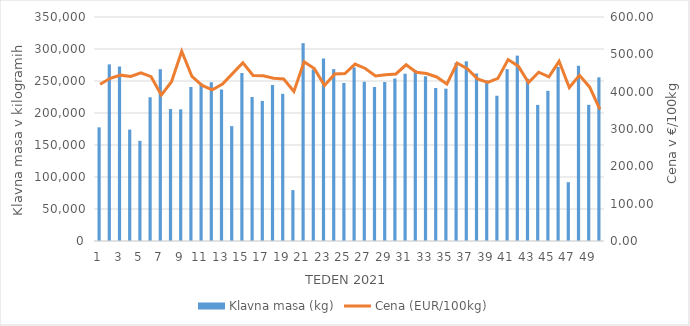
| Category | Klavna masa (kg) |
|---|---|
| 1.0 | 177573 |
| 2.0 | 275951 |
| 3.0 | 272797 |
| 4.0 | 174056 |
| 5.0 | 156508 |
| 6.0 | 224595 |
| 7.0 | 268436 |
| 8.0 | 206193 |
| 9.0 | 205669 |
| 10.0 | 240592 |
| 11.0 | 246325 |
| 12.0 | 248020 |
| 13.0 | 236703 |
| 14.0 | 179478 |
| 15.0 | 262544 |
| 16.0 | 225033 |
| 17.0 | 218950 |
| 18.0 | 243711 |
| 19.0 | 229955 |
| 20.0 | 79521 |
| 21.0 | 309134 |
| 22.0 | 268074 |
| 23.0 | 285151 |
| 24.0 | 268579 |
| 25.0 | 246944 |
| 26.0 | 271319 |
| 27.0 | 248858 |
| 28.0 | 240609 |
| 29.0 | 248383 |
| 30.0 | 253894 |
| 31.0 | 261374 |
| 32.0 | 267142 |
| 33.0 | 257352 |
| 34.0 | 239018 |
| 35.0 | 238034 |
| 36.0 | 278443 |
| 37.0 | 280772 |
| 38.0 | 261791 |
| 39.0 | 250972 |
| 40.0 | 226992 |
| 41.0 | 268523 |
| 42.0 | 289650 |
| 43.0 | 253458 |
| 44.0 | 212689 |
| 45.0 | 234635 |
| 46.0 | 272042 |
| 47.0 | 91884 |
| 48.0 | 273642 |
| 49.0 | 212789 |
| 50.0 | 255740 |